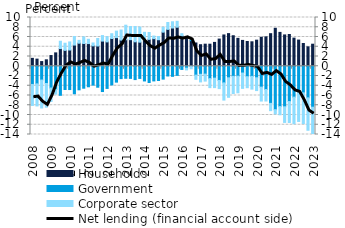
| Category | Households | Government | Corporate sector |
|---|---|---|---|
| 2008.0 | 1.621 | -3.735 | -4.304 |
| 2008.0 | 1.462 | -3.615 | -4.522 |
| 2008.0 | 0.957 | -2.831 | -5.728 |
| 2008.0 | 1.319 | -3.539 | -4.86 |
| 2009.0 | 2.194 | -4.467 | -2.75 |
| 2009.0 | 2.743 | -4.761 | -0.946 |
| 2009.0 | 3.627 | -5.958 | 1.503 |
| 2009.0 | 3.261 | -4.765 | 1.459 |
| 2010.0 | 3.328 | -4.778 | 1.66 |
| 2010.0 | 4.347 | -5.641 | 1.761 |
| 2010.0 | 4.73 | -4.835 | 0.579 |
| 2010.0 | 4.67 | -4.504 | 1.353 |
| 2011.0 | 4.651 | -4.21 | 0.879 |
| 2011.0 | 4.187 | -3.873 | 0.589 |
| 2011.0 | 4.156 | -4.302 | 1.539 |
| 2011.0 | 5.162 | -5.187 | 1.132 |
| 2012.0 | 4.997 | -4.547 | 1.06 |
| 2012.0 | 5.689 | -3.828 | 0.985 |
| 2012.0 | 5.87 | -3.257 | 1.331 |
| 2012.0 | 5.364 | -2.538 | 2.064 |
| 2013.0 | 5.438 | -2.468 | 2.983 |
| 2013.0 | 5.453 | -2.49 | 2.689 |
| 2013.0 | 5.013 | -2.736 | 3.147 |
| 2013.0 | 4.94 | -2.498 | 3.097 |
| 2014.0 | 5.337 | -3.016 | 1.624 |
| 2014.0 | 5.518 | -3.33 | 1.411 |
| 2014.0 | 5.656 | -3.009 | 0.536 |
| 2014.0 | 5.441 | -2.926 | 0.663 |
| 2015.0 | 6.991 | -2.638 | 1 |
| 2015.0 | 7.565 | -1.997 | 1.408 |
| 2015.0 | 7.843 | -2.069 | 1.279 |
| 2015.0 | 8.002 | -1.87 | 1.211 |
| 2016.0 | 6.21 | -0.655 | 0.47 |
| 2016.0 | 5.985 | -0.393 | -0.358 |
| 2016.0 | 5.237 | 0.088 | -0.518 |
| 2016.0 | 4.772 | -1.815 | -0.864 |
| 2017.0 | 4.42 | -1.653 | -1.559 |
| 2017.0 | 4.526 | -1.614 | -1.431 |
| 2017.0 | 4.522 | -2.541 | -1.844 |
| 2017.0 | 4.892 | -2.444 | -1.936 |
| 2018.0 | 5.574 | -2.915 | -1.673 |
| 2018.0 | 6.42 | -3.411 | -3.531 |
| 2018.0 | 6.695 | -2.373 | -3.996 |
| 2018.0 | 6.259 | -2.067 | -3.525 |
| 2019.0 | 5.72 | -2.034 | -3.412 |
| 2019.0 | 5.3 | -1.392 | -3.149 |
| 2019.0 | 5.078 | -2.139 | -2.263 |
| 2019.0 | 5.015 | -2.077 | -2.615 |
| 2020.0 | 5.349 | -2.362 | -2.627 |
| 2020.0 | 5.938 | -4.284 | -2.855 |
| 2020.0 | 6.028 | -4.775 | -2.356 |
| 2020.0 | 6.681 | -7.619 | -1.49 |
| 2021.0 | 7.788 | -8.906 | -0.854 |
| 2021.0 | 6.945 | -8.275 | -1.681 |
| 2021.0 | 6.423 | -8.318 | -3.205 |
| 2021.0 | 6.511 | -7.241 | -4.296 |
| 2022.0 | 5.768 | -6.338 | -5.445 |
| 2022.0 | 5.368 | -5.273 | -6.052 |
| 2022.0 | 4.672 | -5.45 | -6.319 |
| 2022.0 | 3.984 | -6.477 | -6.654 |
| 2023.0 | 4.521 | -8.401 | -5.861 |